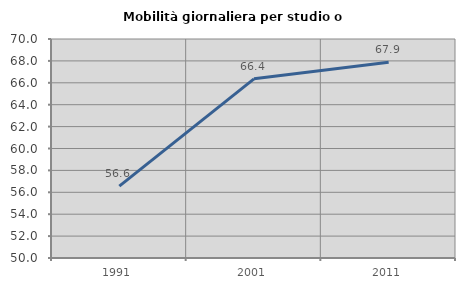
| Category | Mobilità giornaliera per studio o lavoro |
|---|---|
| 1991.0 | 56.571 |
| 2001.0 | 66.365 |
| 2011.0 | 67.871 |